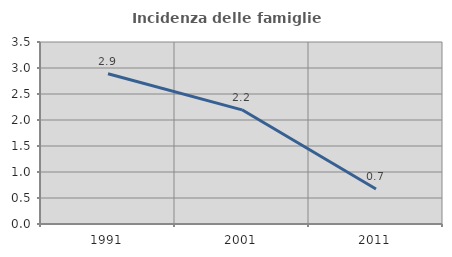
| Category | Incidenza delle famiglie numerose |
|---|---|
| 1991.0 | 2.889 |
| 2001.0 | 2.196 |
| 2011.0 | 0.673 |